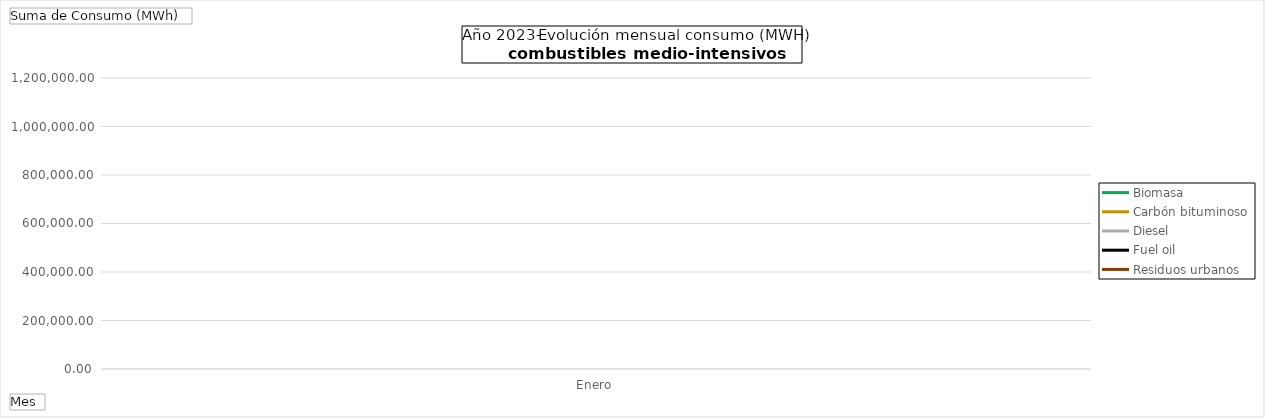
| Category | Biomasa | Carbón bituminoso | Diesel | Fuel oil | Residuos urbanos |
|---|---|---|---|---|---|
| Enero | 1043680.933 | 600491 | 1101367.27 | 774332.65 | 397158.1 |